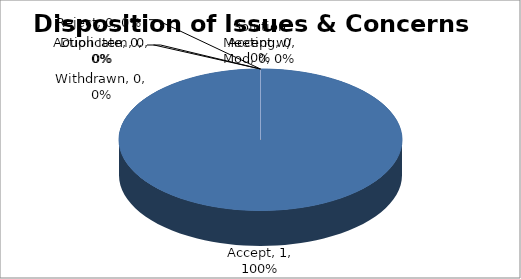
| Category | Series 0 |
|---|---|
| Accept | 1 |
| Accept w/ Mod | 0 |
| Duplicate | 0 |
| Reject | 0 |
| Withdrawn | 0 |
| Solution Meeting | 0 |
| Action Item | 0 |